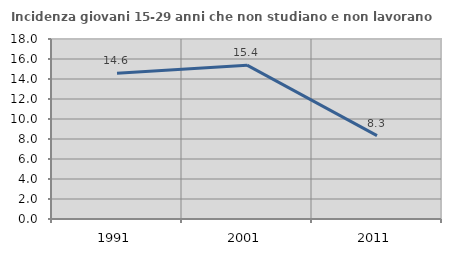
| Category | Incidenza giovani 15-29 anni che non studiano e non lavorano  |
|---|---|
| 1991.0 | 14.583 |
| 2001.0 | 15.385 |
| 2011.0 | 8.333 |